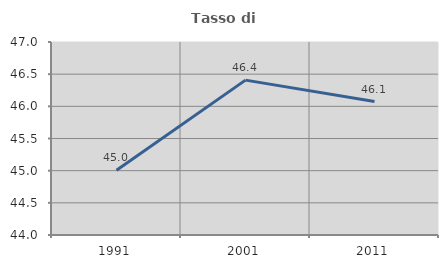
| Category | Tasso di occupazione   |
|---|---|
| 1991.0 | 45.006 |
| 2001.0 | 46.408 |
| 2011.0 | 46.074 |